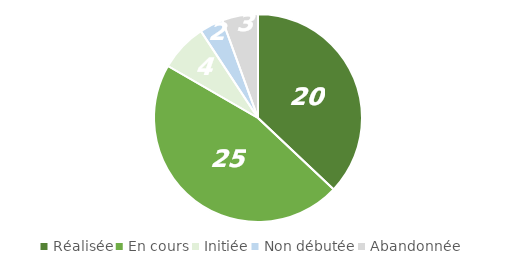
| Category | Series 0 |
|---|---|
| Réalisée | 20 |
| En cours | 25 |
| Initiée | 4 |
| Non débutée | 2 |
| Abandonnée | 3 |